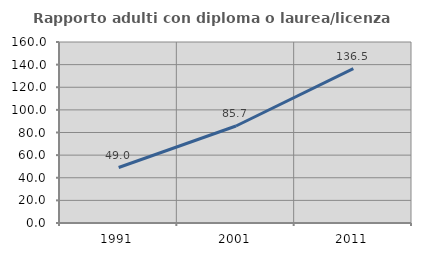
| Category | Rapporto adulti con diploma o laurea/licenza media  |
|---|---|
| 1991.0 | 49.034 |
| 2001.0 | 85.729 |
| 2011.0 | 136.524 |